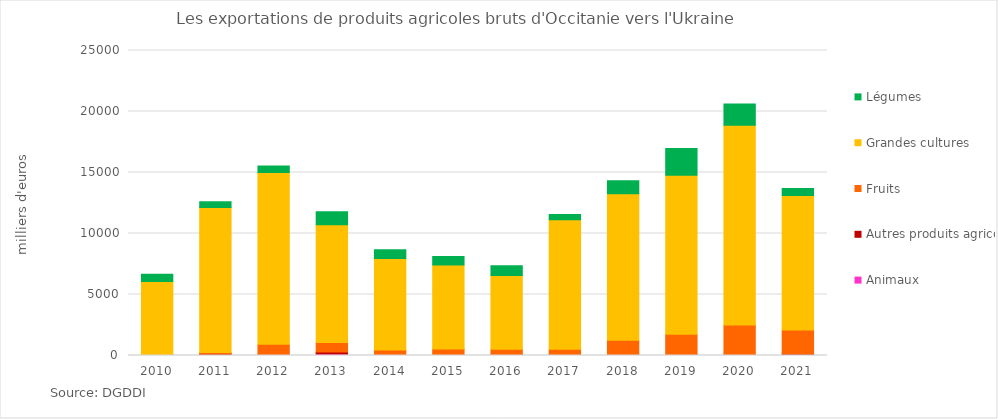
| Category | Animaux | Autres produits agricoles | Fruits | Grandes cultures | Légumes |
|---|---|---|---|---|---|
| 2010.0 | 10.521 | 79.471 | 0 | 5972.662 | 603.166 |
| 2011.0 | 64.56 | 52.159 | 130.01 | 11888.612 | 471.116 |
| 2012.0 | 35.974 | 0.065 | 892.556 | 14062.468 | 533.997 |
| 2013.0 | 119.899 | 162.677 | 783.991 | 9641.926 | 1065.252 |
| 2014.0 | 0 | 0 | 440.931 | 7506.049 | 726.929 |
| 2015.0 | 0 | 6.593 | 534.562 | 6879.928 | 686.96 |
| 2016.0 | 0 | 89.913 | 412.942 | 6064.509 | 787.917 |
| 2017.0 | 0 | 62.101 | 457.566 | 10611.948 | 416.764 |
| 2018.0 | 0 | 32.256 | 1211.212 | 12022.407 | 1059.152 |
| 2019.0 | 0 | 48.365 | 1702.667 | 13031.466 | 2192.669 |
| 2020.0 | 0 | 46.016 | 2461.867 | 16359.331 | 1747.042 |
| 2021.0 | 0 | 128.138 | 1971.652 | 11017.43 | 572.118 |